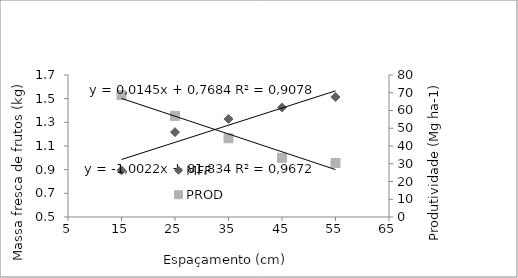
| Category | MFF |
|---|---|
| 15.0 | 0.894 |
| 25.0 | 1.217 |
| 35.0 | 1.329 |
| 45.0 | 1.426 |
| 55.0 | 1.514 |